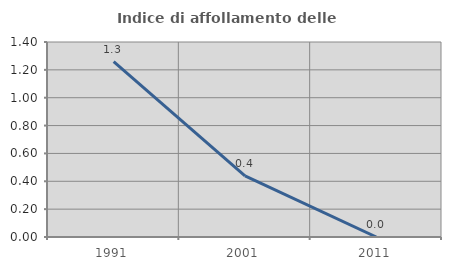
| Category | Indice di affollamento delle abitazioni  |
|---|---|
| 1991.0 | 1.259 |
| 2001.0 | 0.44 |
| 2011.0 | 0 |